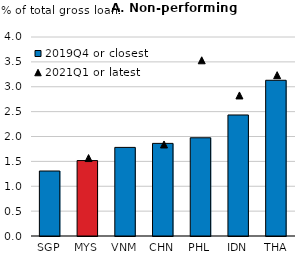
| Category | 2019Q4 or closest |
|---|---|
| SGP | 1.306 |
| MYS | 1.516 |
| VNM | 1.781 |
| CHN | 1.862 |
| PHL | 1.974 |
| IDN | 2.433 |
| THA | 3.13 |